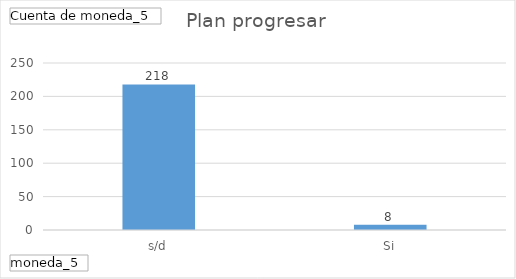
| Category | Total |
|---|---|
| s/d | 218 |
| Si | 8 |